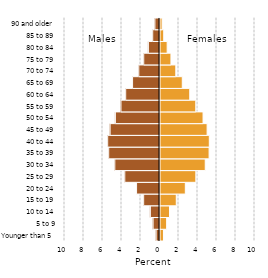
| Category | Series 0 |
|---|---|
| Younger than 5 | 0.364 |
| 5 to 9 | 0.7 |
| 10 to 14 | 0.999 |
| 15 to 19 | 1.715 |
| 20 to 24 | 2.665 |
| 25 to 29 | 3.774 |
| 30 to 34 | 4.762 |
| 35 to 39 | 5.169 |
| 40 to 44 | 5.191 |
| 45 to 49 | 4.96 |
| 50 to 54 | 4.533 |
| 55 to 59 | 3.767 |
| 60 to 64 | 3.133 |
| 65 to 69 | 2.346 |
| 70 to 74 | 1.664 |
| 75 to 79 | 1.153 |
| 80 to 84 | 0.755 |
| 85 to 89 | 0.393 |
| 90 and older | 0.223 |